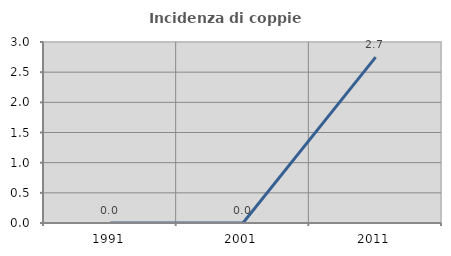
| Category | Incidenza di coppie miste |
|---|---|
| 1991.0 | 0 |
| 2001.0 | 0 |
| 2011.0 | 2.749 |